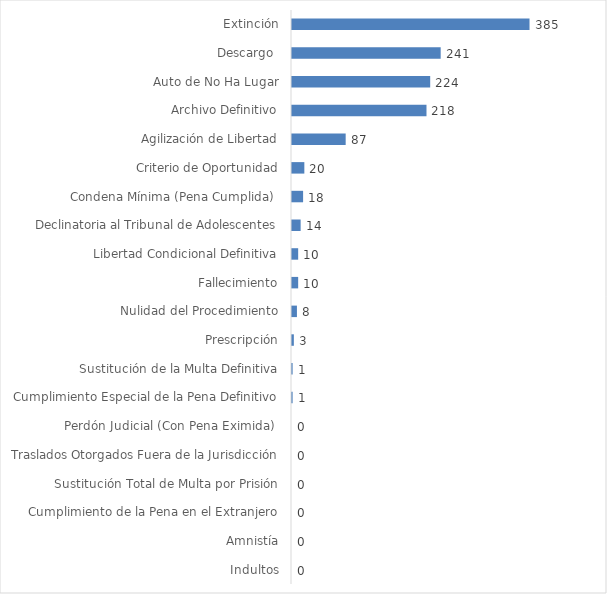
| Category | Series 0 |
|---|---|
| Indultos | 0 |
| Amnistía | 0 |
| Cumplimiento de la Pena en el Extranjero | 0 |
| Sustitución Total de Multa por Prisión | 0 |
| Traslados Otorgados Fuera de la Jurisdicción | 0 |
| Perdón Judicial (Con Pena Eximida)  | 0 |
| Cumplimiento Especial de la Pena Definitivo | 0.001 |
| Sustitución de la Multa Definitiva | 0.001 |
| Prescripción | 0.002 |
| Nulidad del Procedimiento | 0.006 |
| Fallecimiento | 0.008 |
| Libertad Condicional Definitiva | 0.008 |
| Declinatoria al Tribunal de Adolescentes | 0.011 |
| Condena Mínima (Pena Cumplida)  | 0.015 |
| Criterio de Oportunidad | 0.016 |
| Agilización de Libertad | 0.07 |
| Archivo Definitivo | 0.176 |
| Auto de No Ha Lugar | 0.181 |
| Descargo  | 0.194 |
| Extinción | 0.31 |